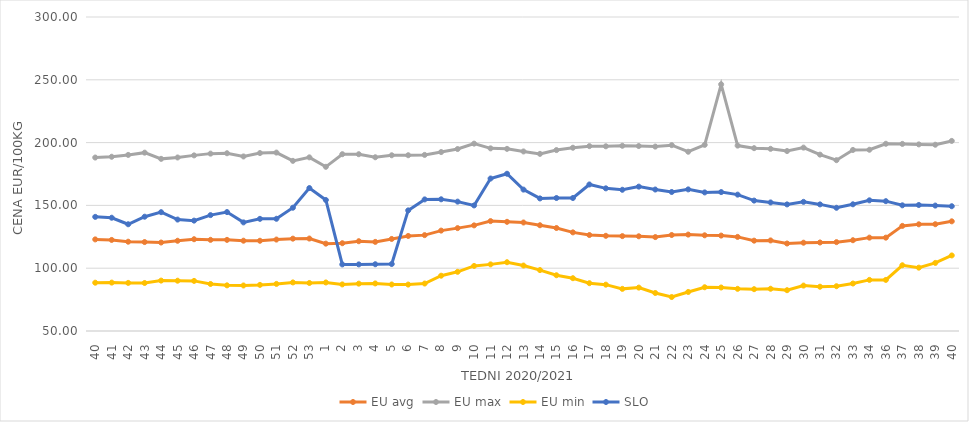
| Category | EU avg | EU max | EU min | SLO |
|---|---|---|---|---|
| 40.0 | 122.936 | 188.11 | 88.45 | 140.87 |
| 41.0 | 122.507 | 188.73 | 88.54 | 140.18 |
| 42.0 | 121.098 | 190.2 | 88.3 | 134.98 |
| 43.0 | 120.822 | 191.99 | 88.22 | 141 |
| 44.0 | 120.448 | 187.06 | 90.13 | 144.61 |
| 45.0 | 121.843 | 188.15 | 90.04 | 138.73 |
| 46.0 | 123.07 | 189.82 | 89.89 | 137.88 |
| 47.0 | 122.58 | 191.22 | 87.43 | 142.27 |
| 48.0 | 122.553 | 191.52 | 86.35 | 144.69 |
| 49.0 | 121.893 | 188.97 | 86.24 | 136.47 |
| 50.0 | 121.851 | 191.67 | 86.72 | 139.29 |
| 51.0 | 122.8 | 192.06 | 87.5 | 139.35 |
| 52.0 | 123.52 | 185.468 | 88.67 | 148.16 |
| 53.0 | 123.611 | 188.25 | 88.23 | 163.81 |
| 1.0 | 119.553 | 180.72 | 88.64 | 154.31 |
| 2.0 | 119.893 | 190.77 | 87.1 | 103.02 |
| 3.0 | 121.489 | 190.76 | 87.7 | 103.03 |
| 4.0 | 120.954 | 188.33 | 87.88 | 103.15 |
| 5.0 | 123.293 | 189.91 | 87.04 | 103.34 |
| 6.0 | 125.679 | 189.94 | 86.97 | 146.03 |
| 7.0 | 126.33 | 190.21 | 87.79 | 154.77 |
| 8.0 | 129.933 | 192.48 | 94.02 | 154.86 |
| 9.0 | 131.908 | 194.884 | 97.12 | 153 |
| 10.0 | 134.098 | 199.17 | 101.79 | 149.98 |
| 11.0 | 137.49 | 195.419 | 103.05 | 171.4 |
| 12.0 | 136.929 | 195.013 | 104.76 | 175.2 |
| 13.0 | 136.39 | 192.952 | 102.11 | 162.57 |
| 14.0 | 134.198 | 191.034 | 98.5 | 155.55 |
| 15.0 | 132.003 | 194.047 | 94.39 | 155.88 |
| 16.0 | 128.53 | 195.913 | 92.04 | 155.88 |
| 17.0 | 126.415 | 197.188 | 88.07 | 166.66 |
| 18.0 | 125.787 | 197.055 | 86.89 | 163.58 |
| 19.0 | 125.54 | 197.478 | 83.546 | 162.44 |
| 20.0 | 125.412 | 197.263 | 84.55 | 164.94 |
| 21.0 | 124.768 | 196.821 | 80.264 | 162.64 |
| 22.0 | 126.43 | 197.963 | 77.048 | 160.68 |
| 23.0 | 126.76 | 192.72 | 81.087 | 162.75 |
| 24.0 | 126.19 | 198.186 | 84.83 | 160.34 |
| 25.0 | 125.97 | 246.36 | 84.63 | 160.6 |
| 26.0 | 124.92 | 197.607 | 83.57 | 158.57 |
| 27.0 | 121.922 | 195.566 | 83.3 | 153.83 |
| 28.0 | 122.106 | 195.043 | 83.64 | 152.35 |
| 29.0 | 119.659 | 193.272 | 82.49 | 150.79 |
| 30.0 | 120.3 | 196.01 | 86.16 | 152.82 |
| 31.0 | 120.473 | 190.42 | 85.26 | 150.8 |
| 32.0 | 120.756 | 186 | 85.65 | 148.1 |
| 33.0 | 122.274 | 194.145 | 87.8 | 150.88 |
| 34.0 | 124.332 | 194.304 | 90.69 | 154.04 |
| 36.0 | 124.332 | 199.06 | 90.69 | 153.37 |
| 37.0 | 133.685 | 198.97 | 102.334 | 150.06 |
| 38.0 | 134.959 | 198.57 | 100.43 | 150.32 |
| 39.0 | 135.021 | 198.3 | 104.21 | 149.86 |
| 40.0 | 137.315 | 201.34 | 110.15 | 149.34 |